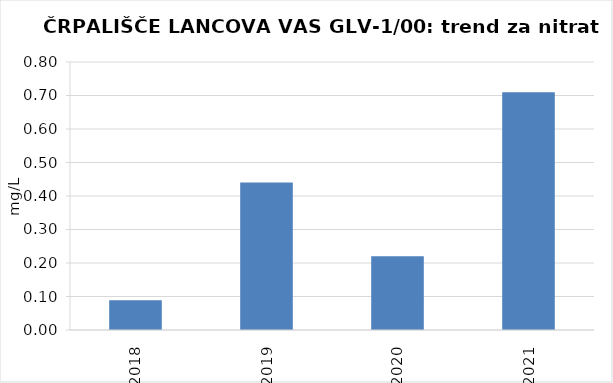
| Category | Vsota |
|---|---|
| 2018 | 0.089 |
| 2019 | 0.44 |
| 2020 | 0.22 |
| 2021 | 0.71 |